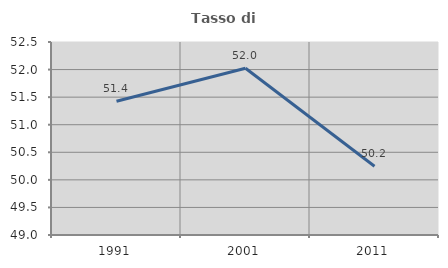
| Category | Tasso di occupazione   |
|---|---|
| 1991.0 | 51.425 |
| 2001.0 | 52.023 |
| 2011.0 | 50.246 |